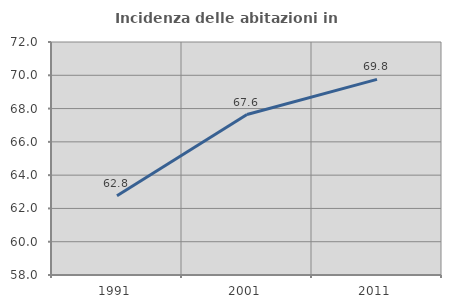
| Category | Incidenza delle abitazioni in proprietà  |
|---|---|
| 1991.0 | 62.766 |
| 2001.0 | 67.642 |
| 2011.0 | 69.752 |